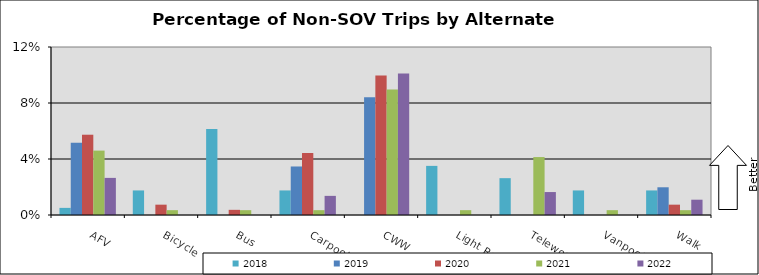
| Category | 2018 | 2019 | 2020 | 2021 | 2022 |
|---|---|---|---|---|---|
| AFV | 0.005 | 0.052 | 0.057 | 0.046 | 0.027 |
| Bicycle | 0.018 | 0 | 0.007 | 0.003 | 0 |
| Bus | 0.061 | 0 | 0.004 | 0.003 | 0 |
| Carpool | 0.018 | 0.035 | 0.044 | 0.003 | 0.014 |
| CWW | 0 | 0.084 | 0.1 | 0.09 | 0.101 |
| Light Rail | 0.035 | 0 | 0 | 0.003 | 0 |
| Telework | 0.026 | 0 | 0 | 0.041 | 0.016 |
| Vanpool | 0.018 | 0 | 0 | 0.003 | 0 |
| Walk | 0.018 | 0.02 | 0.007 | 0.003 | 0.011 |